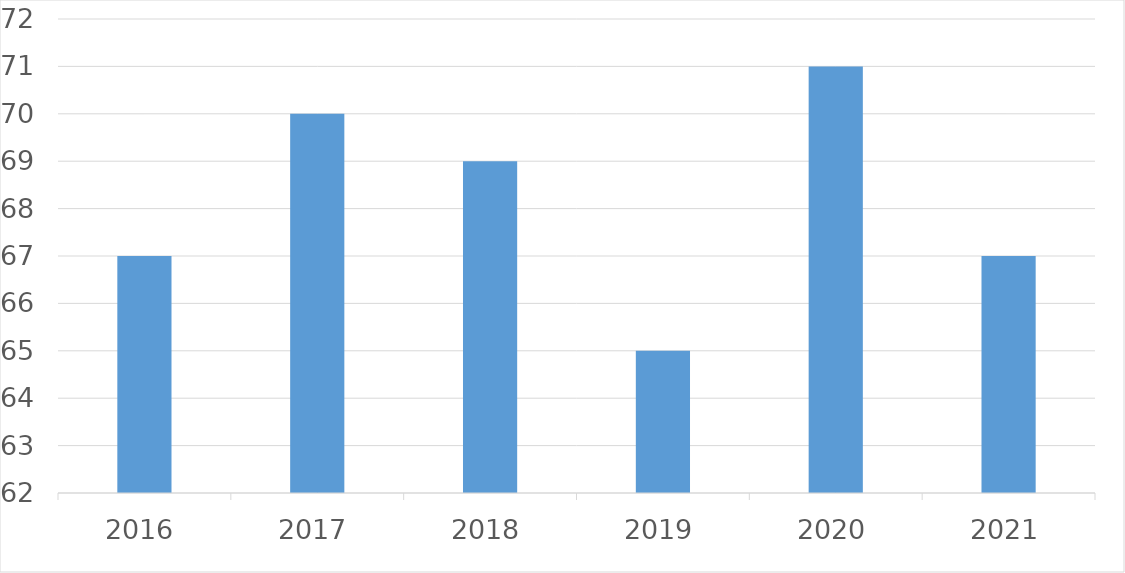
| Category | Series 0 |
|---|---|
| 2016 | 67 |
| 2017 | 70 |
| 2018 | 69 |
| 2019 | 65 |
| 2020 | 71 |
| 2021 | 67 |